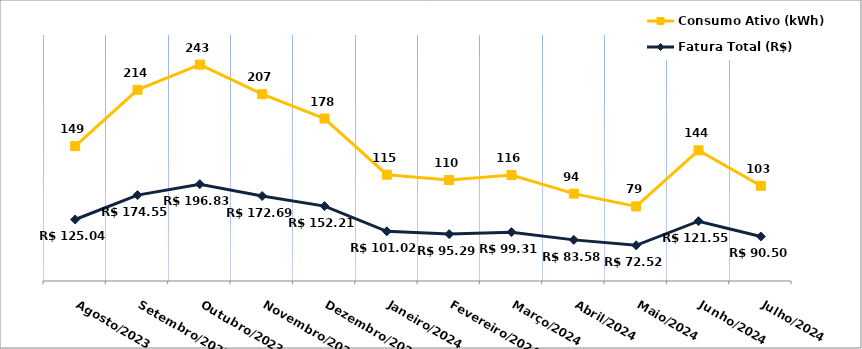
| Category | Fatura Total (R$) | Consumo Ativo (kWh) |
|---|---|---|
| Agosto/2023 | 125.04 | 149 |
| Setembro/2023 | 174.55 | 214 |
| Outubro/2023 | 196.83 | 243 |
| Novembro/2023 | 172.69 | 207 |
| Dezembro/2023 | 152.21 | 178 |
| Janeiro/2024 | 101.02 | 115 |
| Fevereiro/2024 | 95.29 | 110 |
| Março/2024 | 99.31 | 116 |
| Abril/2024 | 83.58 | 94 |
| Maio/2024 | 72.52 | 79 |
| Junho/2024 | 121.55 | 144 |
| Julho/2024 | 90.5 | 103 |